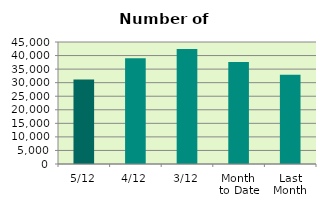
| Category | Series 0 |
|---|---|
| 5/12 | 31200 |
| 4/12 | 39020 |
| 3/12 | 42374 |
| Month 
to Date | 37651 |
| Last
Month | 32932.667 |